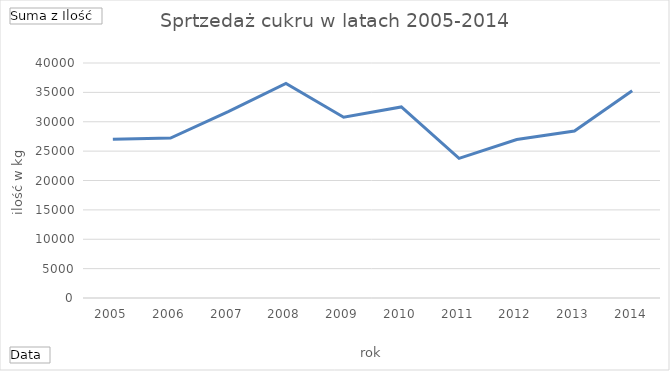
| Category | Suma |
|---|---|
| 2005 | 27016 |
| 2006 | 27226 |
| 2007 | 31720 |
| 2008 | 36523 |
| 2009 | 30764 |
| 2010 | 32521 |
| 2011 | 23778 |
| 2012 | 26976 |
| 2013 | 28419 |
| 2014 | 35284 |